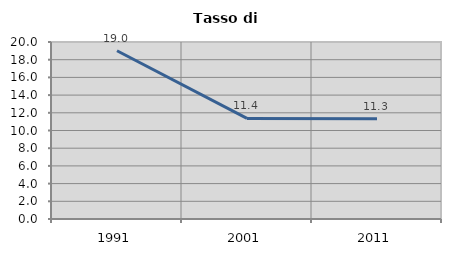
| Category | Tasso di disoccupazione   |
|---|---|
| 1991.0 | 19.01 |
| 2001.0 | 11.363 |
| 2011.0 | 11.339 |